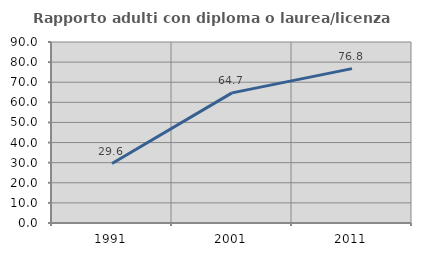
| Category | Rapporto adulti con diploma o laurea/licenza media  |
|---|---|
| 1991.0 | 29.552 |
| 2001.0 | 64.706 |
| 2011.0 | 76.77 |